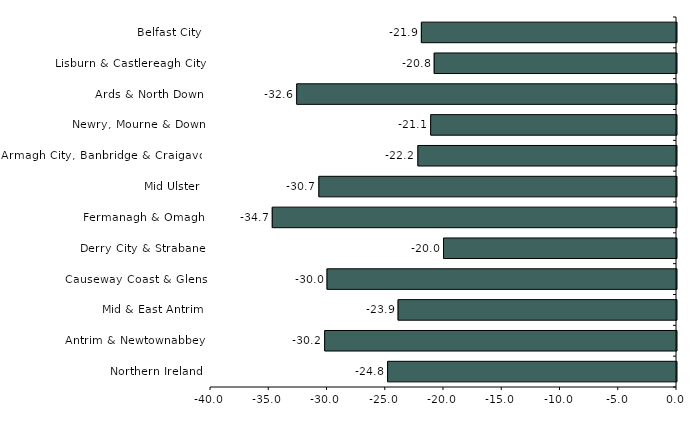
| Category | Series 0 |
|---|---|
| Belfast City | -21.9 |
| Lisburn & Castlereagh City | -20.8 |
| Ards & North Down | -32.6 |
| Newry, Mourne & Down | -21.1 |
| Armagh City, Banbridge & Craigavon | -22.2 |
| Mid Ulster | -30.7 |
| Fermanagh & Omagh | -34.7 |
| Derry City & Strabane | -20 |
| Causeway Coast & Glens | -30 |
| Mid & East Antrim | -23.9 |
| Antrim & Newtownabbey | -30.2 |
| Northern Ireland | -24.8 |